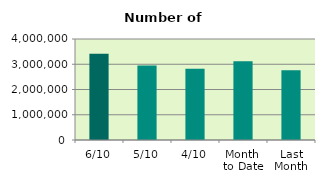
| Category | Series 0 |
|---|---|
| 6/10 | 3411378 |
| 5/10 | 2954954 |
| 4/10 | 2818478 |
| Month 
to Date | 3119562.5 |
| Last
Month | 2759252.364 |